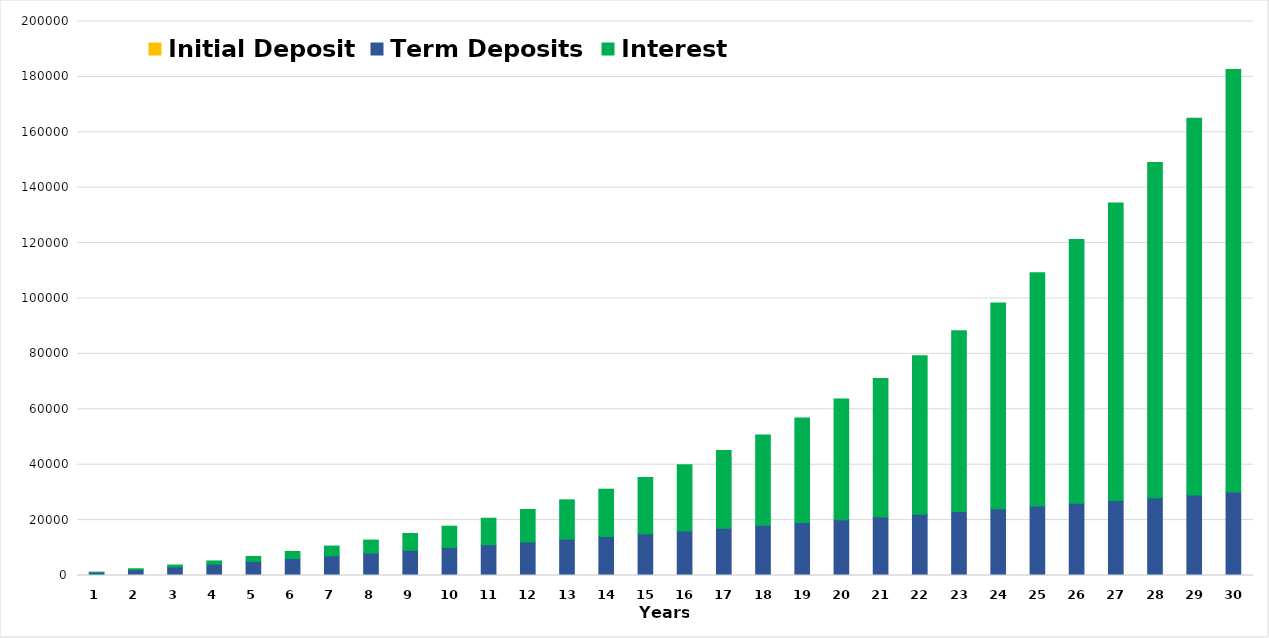
| Category | Initial Deposit | Term Deposits | Interest |
|---|---|---|---|
| 1.0 | 100 | 1000 | 110 |
| 2.0 | 100 | 2000 | 331 |
| 3.0 | 100 | 3000 | 674.1 |
| 4.0 | 100 | 4000 | 1151.51 |
| 5.0 | 100 | 5000 | 1776.661 |
| 6.0 | 100 | 6000 | 2564.327 |
| 7.0 | 100 | 7000 | 3530.76 |
| 8.0 | 100 | 8000 | 4693.836 |
| 9.0 | 100 | 9000 | 6073.219 |
| 10.0 | 100 | 10000 | 7690.541 |
| 11.0 | 100 | 11000 | 9569.595 |
| 12.0 | 100 | 12000 | 11736.555 |
| 13.0 | 100 | 13000 | 14220.21 |
| 14.0 | 100 | 14000 | 17052.232 |
| 15.0 | 100 | 15000 | 20267.455 |
| 16.0 | 100 | 16000 | 23904.2 |
| 17.0 | 100 | 17000 | 28004.62 |
| 18.0 | 100 | 18000 | 32615.082 |
| 19.0 | 100 | 19000 | 37786.59 |
| 20.0 | 100 | 20000 | 43575.249 |
| 21.0 | 100 | 21000 | 50042.774 |
| 22.0 | 100 | 22000 | 57257.052 |
| 23.0 | 100 | 23000 | 65292.757 |
| 24.0 | 100 | 24000 | 74232.033 |
| 25.0 | 100 | 25000 | 84165.236 |
| 26.0 | 100 | 26000 | 95191.76 |
| 27.0 | 100 | 27000 | 107420.936 |
| 28.0 | 100 | 28000 | 120973.029 |
| 29.0 | 100 | 29000 | 135980.332 |
| 30.0 | 100 | 30000 | 152588.365 |